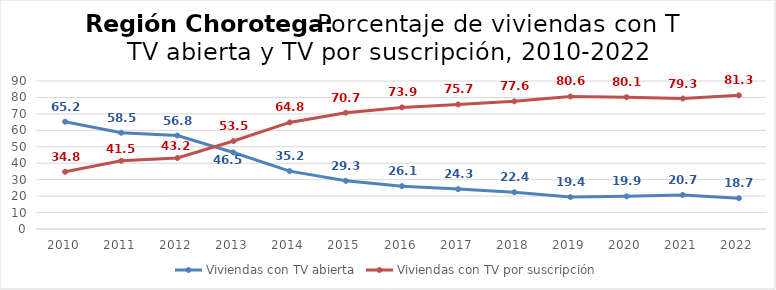
| Category | Viviendas con TV abierta | Viviendas con TV por suscripción |
|---|---|---|
| 2010.0 | 65.242 | 34.758 |
| 2011.0 | 58.502 | 41.498 |
| 2012.0 | 56.838 | 43.162 |
| 2013.0 | 46.5 | 53.5 |
| 2014.0 | 35.192 | 64.808 |
| 2015.0 | 29.293 | 70.707 |
| 2016.0 | 26.056 | 73.944 |
| 2017.0 | 24.255 | 75.745 |
| 2018.0 | 22.354 | 77.646 |
| 2019.0 | 19.422 | 80.578 |
| 2020.0 | 19.854 | 80.146 |
| 2021.0 | 20.675 | 79.325 |
| 2022.0 | 18.711 | 81.289 |